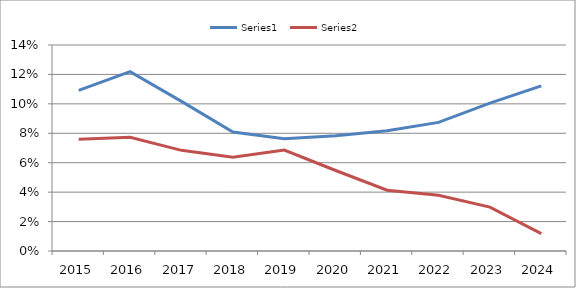
| Category | Series 0 | Series 1 |
|---|---|---|
| 2015.0 | 0.109 | 0.076 |
| 2016.0 | 0.122 | 0.077 |
| 2017.0 | 0.102 | 0.068 |
| 2018.0 | 0.081 | 0.064 |
| 2019.0 | 0.076 | 0.069 |
| 2020.0 | 0.078 | 0.055 |
| 2021.0 | 0.082 | 0.041 |
| 2022.0 | 0.087 | 0.038 |
| 2023.0 | 0.1 | 0.03 |
| 2024.0 | 0.112 | 0.012 |